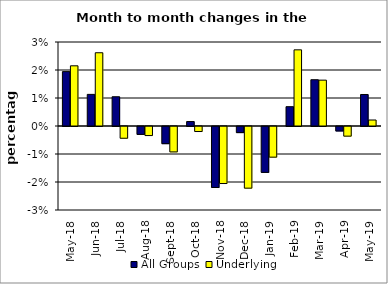
| Category | All Groups | Underlying |
|---|---|---|
| 2018-05-01 | 0.019 | 0.021 |
| 2018-06-01 | 0.011 | 0.026 |
| 2018-07-01 | 0.01 | -0.004 |
| 2018-08-01 | -0.003 | -0.003 |
| 2018-09-01 | -0.006 | -0.009 |
| 2018-10-01 | 0.002 | -0.002 |
| 2018-11-01 | -0.022 | -0.02 |
| 2018-12-01 | -0.002 | -0.022 |
| 2019-01-01 | -0.016 | -0.011 |
| 2019-02-01 | 0.007 | 0.027 |
| 2019-03-01 | 0.017 | 0.016 |
| 2019-04-01 | -0.002 | -0.003 |
| 2019-05-01 | 0.011 | 0.002 |